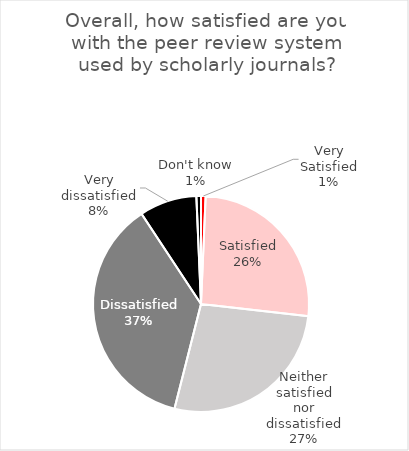
| Category | Overall, how satisfied are you with the peer review system used by scholarly journals? |
|---|---|
| Very Satisfied | 2 |
| Satisfied | 76 |
| Neither satisfied nor dissatisfied | 79 |
| Dissatisfied | 107 |
| Very dissatisfied | 25 |
| Don't know | 2 |